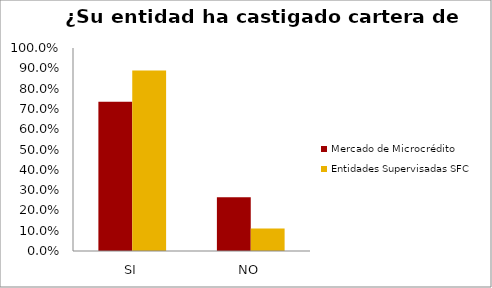
| Category | Mercado de Microcrédito | Entidades Supervisadas SFC |
|---|---|---|
| SI | 0.735 | 0.889 |
| NO | 0.265 | 0.111 |